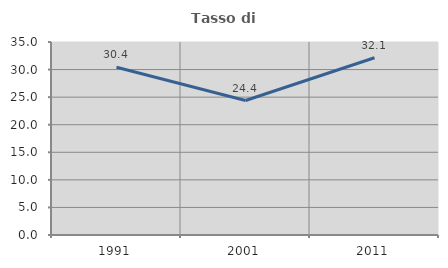
| Category | Tasso di occupazione   |
|---|---|
| 1991.0 | 30.411 |
| 2001.0 | 24.388 |
| 2011.0 | 32.143 |